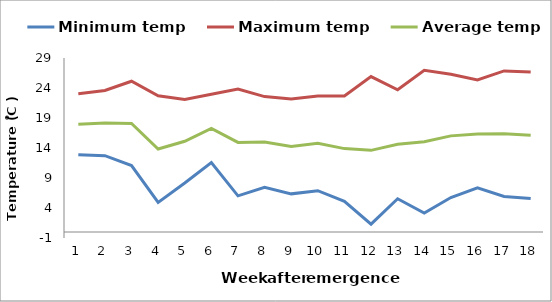
| Category | Minimum temp | Maximum temp | Average temp |
|---|---|---|---|
| 0 | 12.886 | 23.057 | 17.971 |
| 1 | 12.714 | 23.586 | 18.15 |
| 2 | 11.071 | 25.129 | 18.1 |
| 3 | 4.943 | 22.714 | 13.829 |
| 4 | 8.157 | 22.1 | 15.129 |
| 5 | 11.571 | 22.957 | 17.264 |
| 6 | 6.029 | 23.843 | 14.936 |
| 7 | 7.443 | 22.571 | 15.007 |
| 8 | 6.357 | 22.157 | 14.257 |
| 9 | 6.886 | 22.657 | 14.771 |
| 10 | 5.114 | 22.686 | 13.9 |
| 11 | 1.314 | 25.9 | 13.607 |
| 12 | 5.543 | 23.7 | 14.621 |
| 13 | 3.157 | 26.943 | 15.05 |
| 14 | 5.743 | 26.3 | 16.021 |
| 15 | 7.357 | 25.343 | 16.35 |
| 16 | 5.929 | 26.843 | 16.386 |
| 17 | 5.6 | 26.671 | 16.136 |